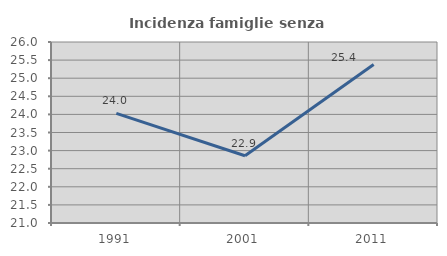
| Category | Incidenza famiglie senza nuclei |
|---|---|
| 1991.0 | 24.028 |
| 2001.0 | 22.857 |
| 2011.0 | 25.376 |